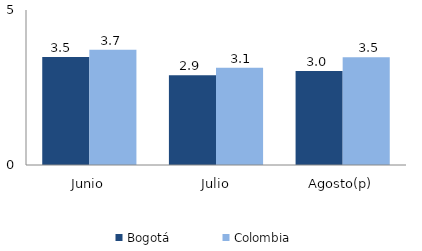
| Category | Bogotá | Colombia |
|---|---|---|
| Junio | 3.486 | 3.717 |
| Julio | 2.898 | 3.139 |
| Agosto(p) | 3.036 | 3.474 |